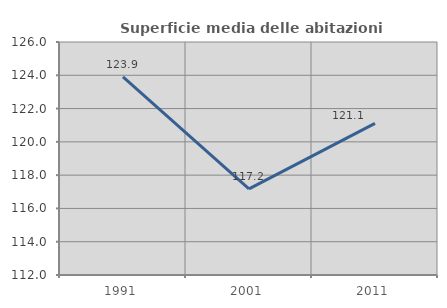
| Category | Superficie media delle abitazioni occupate |
|---|---|
| 1991.0 | 123.907 |
| 2001.0 | 117.176 |
| 2011.0 | 121.112 |